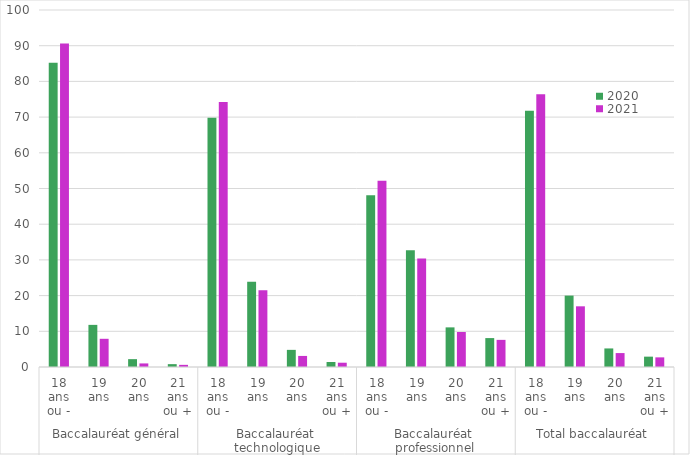
| Category | 2020 | 2021 |
|---|---|---|
| 0 | 85.2 | 90.6 |
| 1 | 11.8 | 7.9 |
| 2 | 2.2 | 1 |
| 3 | 0.8 | 0.6 |
| 4 | 69.8 | 74.2 |
| 5 | 23.9 | 21.5 |
| 6 | 4.8 | 3.1 |
| 7 | 1.4 | 1.2 |
| 8 | 48.1 | 52.2 |
| 9 | 32.7 | 30.4 |
| 10 | 11.1 | 9.8 |
| 11 | 8.1 | 7.6 |
| 12 | 71.8 | 76.4 |
| 13 | 20 | 17 |
| 14 | 5.2 | 3.9 |
| 15 | 2.9 | 2.7 |